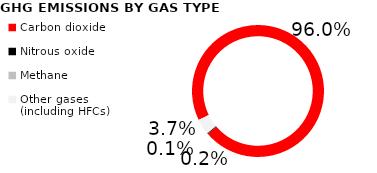
| Category | Series 0 |
|---|---|
| Carbon dioxide | 0.96 |
| Nitrous oxide | 0.002 |
| Methane | 0.001 |
| Other gases (including HFCs) | 0.037 |